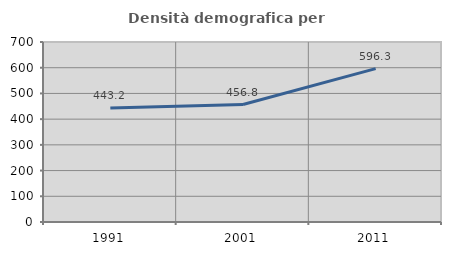
| Category | Densità demografica |
|---|---|
| 1991.0 | 443.19 |
| 2001.0 | 456.792 |
| 2011.0 | 596.301 |